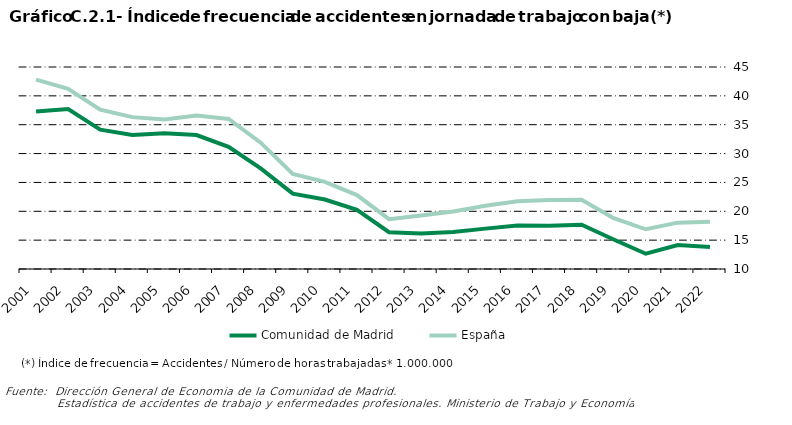
| Category | Comunidad de Madrid | España |
|---|---|---|
| 2001.0 | 37.291 | 42.8 |
| 2002.0 | 37.712 | 41.206 |
| 2003.0 | 34.147 | 37.623 |
| 2004.0 | 33.21 | 36.316 |
| 2005.0 | 33.504 | 35.912 |
| 2006.0 | 33.2 | 36.6 |
| 2007.0 | 31.174 | 36 |
| 2008.0 | 27.424 | 31.89 |
| 2009.0 | 23.054 | 26.468 |
| 2010.0 | 22.047 | 25.109 |
| 2011.0 | 20.248 | 22.814 |
| 2012.0 | 16.367 | 18.642 |
| 2013.0 | 16.134 | 19.252 |
| 2014.0 | 16.398 | 19.958 |
| 2015.0 | 16.996 | 20.971 |
| 2016.0 | 17.553 | 21.749 |
| 2017.0 | 17.514 | 21.97 |
| 2018.0 | 17.676 | 21.989 |
| 2019.0 | 15.107 | 18.804 |
| 2020.0 | 12.642 | 16.879 |
| 2021.0 | 14.136 | 18.034 |
| 2022.0 | 13.809 | 18.166 |